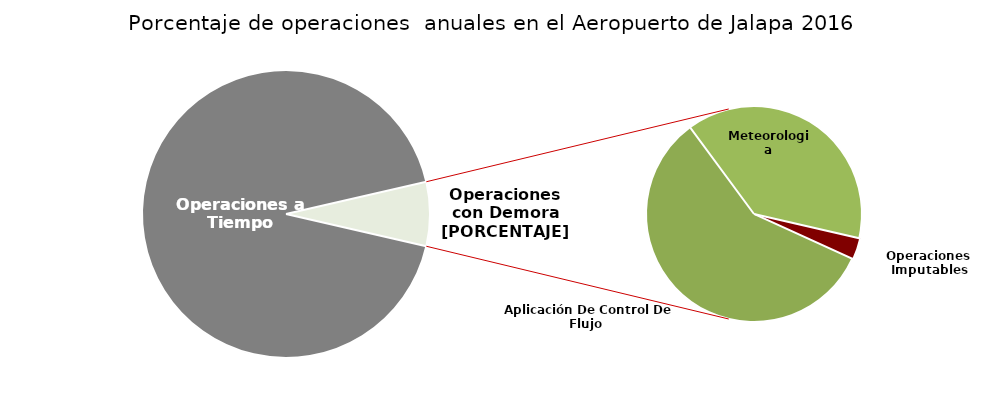
| Category | Series 0 |
|---|---|
| Operaciones a Tiempo | 400 |
| Operaciones Imputables | 1 |
| Aplicación De Control De Flujo  | 18 |
| Meteorologia | 12 |